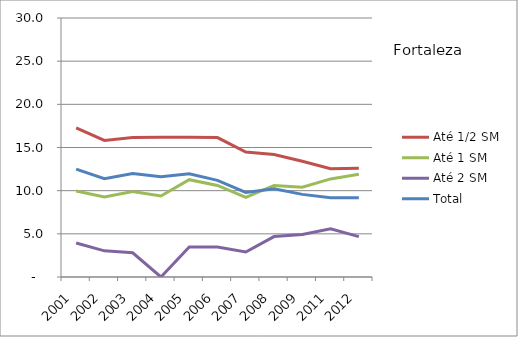
| Category | Até 1/2 SM | Até 1 SM | Até 2 SM | Total |
|---|---|---|---|---|
| 2001.0 | 17.26 | 9.96 | 3.93 | 12.5 |
| 2002.0 | 15.82 | 9.27 | 3.03 | 11.39 |
| 2003.0 | 16.17 | 9.91 | 2.8 | 11.98 |
| 2004.0 | 16.18 | 9.38 | 0 | 11.6 |
| 2005.0 | 16.2 | 11.27 | 3.48 | 11.96 |
| 2006.0 | 16.15 | 10.6 | 3.47 | 11.2 |
| 2007.0 | 14.48 | 9.23 | 2.9 | 9.8 |
| 2008.0 | 14.19 | 10.61 | 4.68 | 10.21 |
| 2009.0 | 13.41 | 10.39 | 4.92 | 9.57 |
| 2011.0 | 12.54 | 11.36 | 5.59 | 9.18 |
| 2012.0 | 12.61 | 11.89 | 4.68 | 9.18 |